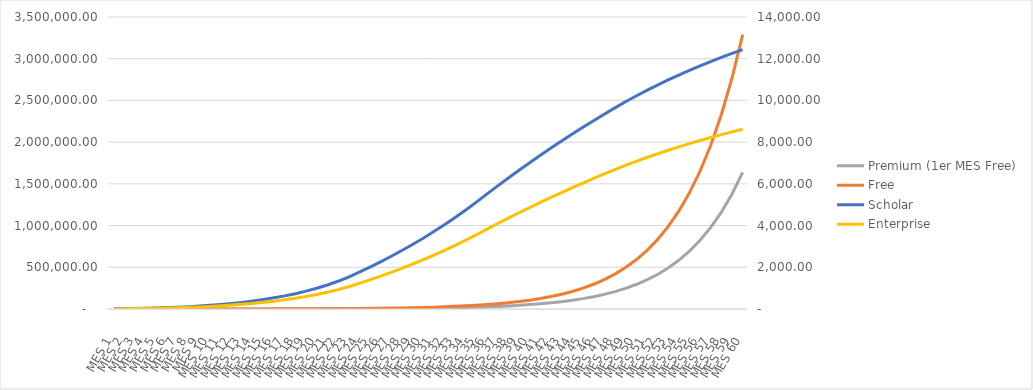
| Category | Premium (1er MES Free) | Free |
|---|---|---|
| MES 1 | 0 | 30 |
| MES 2 | 9 | 57 |
| MES 3 | 23 | 86 |
| MES 4 | 40 | 120 |
| MES 5 | 60 | 161 |
| MES 6 | 84 | 209 |
| MES 7 | 113 | 266 |
| MES 8 | 147 | 334 |
| MES 9 | 188 | 414 |
| MES 10 | 236 | 510 |
| MES 11 | 293 | 624 |
| MES 12 | 360 | 760 |
| MES 13 | 440 | 921 |
| MES 14 | 535 | 1112 |
| MES 15 | 648 | 1339 |
| MES 16 | 782 | 1609 |
| MES 17 | 941 | 1930 |
| MES 18 | 1130 | 2311 |
| MES 19 | 1355 | 2763 |
| MES 20 | 1622 | 3300 |
| MES 21 | 1939 | 3938 |
| MES 22 | 2316 | 4695 |
| MES 23 | 2763 | 5595 |
| MES 24 | 3294 | 6664 |
| MES 25 | 3925 | 7933 |
| MES 26 | 4675 | 9439 |
| MES 27 | 5566 | 11227 |
| MES 28 | 6624 | 13350 |
| MES 29 | 7880 | 15871 |
| MES 30 | 9371 | 18865 |
| MES 31 | 11142 | 22420 |
| MES 32 | 13245 | 26642 |
| MES 33 | 15742 | 31656 |
| MES 34 | 18707 | 37610 |
| MES 35 | 22228 | 44680 |
| MES 36 | 26408 | 53077 |
| MES 37 | 31372 | 63048 |
| MES 38 | 37268 | 74887 |
| MES 39 | 44269 | 88946 |
| MES 40 | 52582 | 105642 |
| MES 41 | 62454 | 125468 |
| MES 42 | 74177 | 149011 |
| MES 43 | 88098 | 176968 |
| MES 44 | 104628 | 210168 |
| MES 45 | 124258 | 249592 |
| MES 46 | 147569 | 296408 |
| MES 47 | 175251 | 352002 |
| MES 48 | 208123 | 418020 |
| MES 49 | 247159 | 496416 |
| MES 50 | 293514 | 589512 |
| MES 51 | 348560 | 700064 |
| MES 52 | 413927 | 831345 |
| MES 53 | 491551 | 987241 |
| MES 54 | 583730 | 1172367 |
| MES 55 | 693193 | 1392204 |
| MES 56 | 823180 | 1653261 |
| MES 57 | 977539 | 1963267 |
| MES 58 | 1160841 | 2331398 |
| MES 59 | 1378512 | 2768554 |
| MES 60 | 1636996 | 3287677 |